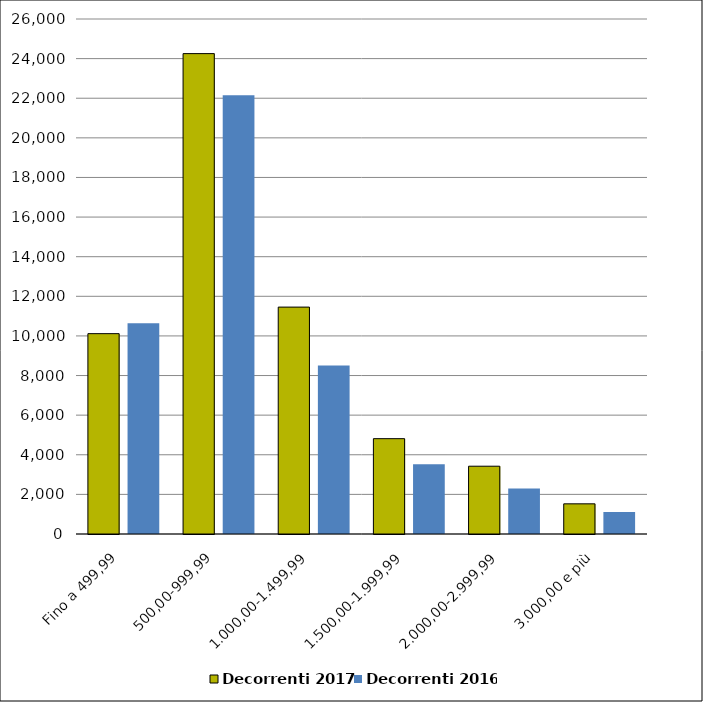
| Category | Decorrenti 2017 | Decorrenti 2016 |
|---|---|---|
| Fino a 499,99 | 10115 | 10638 |
| 500,00-999,99 | 24252 | 22154 |
| 1.000,00-1.499,99 | 11455 | 8502 |
| 1.500,00-1.999,99 | 4813 | 3523 |
| 2.000,00-2.999,99 | 3422 | 2296 |
| 3.000,00 e più | 1523 | 1115 |